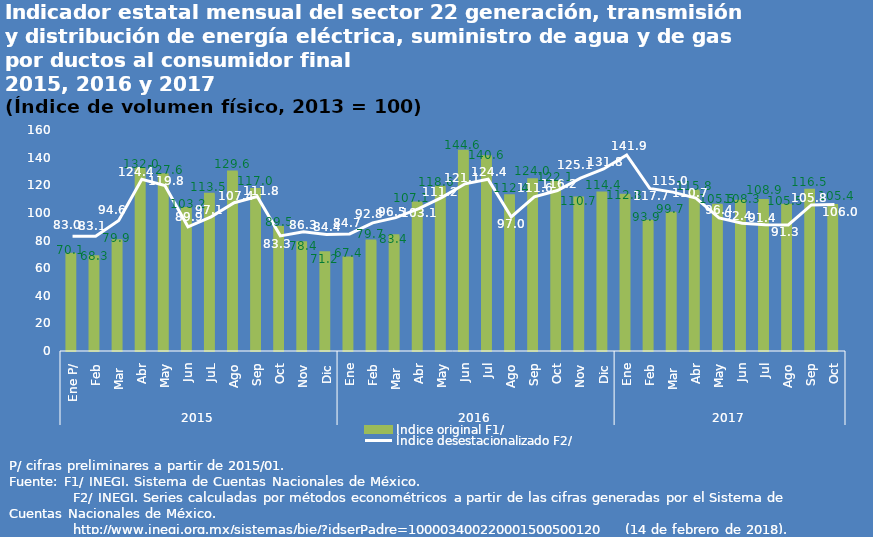
| Category | Índice original F1/ |
|---|---|
| 0 | 70.117 |
| 1 | 68.32 |
| 2 | 79.877 |
| 3 | 132 |
| 4 | 127.566 |
| 5 | 103.248 |
| 6 | 113.486 |
| 7 | 129.585 |
| 8 | 117.012 |
| 9 | 89.53 |
| 10 | 78.409 |
| 11 | 71.196 |
| 12 | 67.384 |
| 13 | 79.707 |
| 14 | 83.43 |
| 15 | 107.114 |
| 16 | 118.633 |
| 17 | 144.574 |
| 18 | 140.606 |
| 19 | 112.365 |
| 20 | 124.002 |
| 21 | 122.135 |
| 22 | 110.723 |
| 23 | 114.394 |
| 24 | 112.821 |
| 25 | 93.895 |
| 26 | 99.7 |
| 27 | 115.759 |
| 28 | 105.471 |
| 29 | 108.339 |
| 30 | 108.912 |
| 31 | 105.499 |
| 32 | 116.456 |
| 33 | 105.383 |